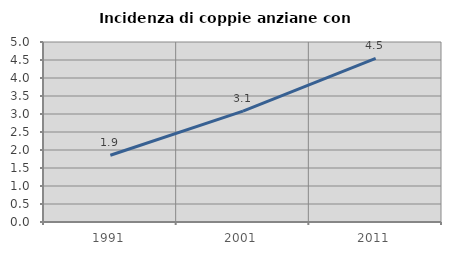
| Category | Incidenza di coppie anziane con figli |
|---|---|
| 1991.0 | 1.854 |
| 2001.0 | 3.079 |
| 2011.0 | 4.545 |